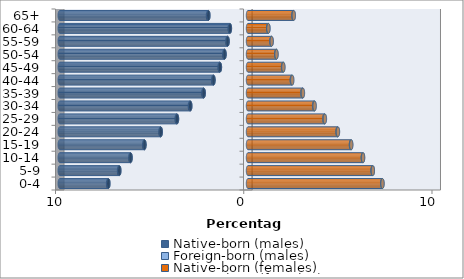
| Category | Native-born (males) | Foreign-born (males) | Native-born (females) | Foreign-born (females) |
|---|---|---|---|---|
| 0-4 | -7.419 | -0.015 | 7.134 | 0.011 |
| 5-9 | -6.837 | -0.013 | 6.621 | 0.011 |
| 10-14 | -6.238 | -0.014 | 6.102 | 0.013 |
| 15-19 | -5.501 | -0.015 | 5.47 | 0.017 |
| 20-24 | -4.636 | -0.017 | 4.758 | 0.022 |
| 25-29 | -3.772 | -0.019 | 4.06 | 0.026 |
| 30-34 | -3.067 | -0.021 | 3.514 | 0.028 |
| 35-39 | -2.354 | -0.021 | 2.891 | 0.027 |
| 40-44 | -1.834 | -0.019 | 2.33 | 0.024 |
| 45-49 | -1.493 | -0.016 | 1.863 | 0.018 |
| 50-54 | -1.247 | -0.013 | 1.501 | 0.014 |
| 55-59 | -1.085 | -0.01 | 1.247 | 0.01 |
| 60-64 | -0.962 | -0.008 | 1.077 | 0.007 |
| 65+ | -2.106 | -0.02 | 2.412 | 0.022 |